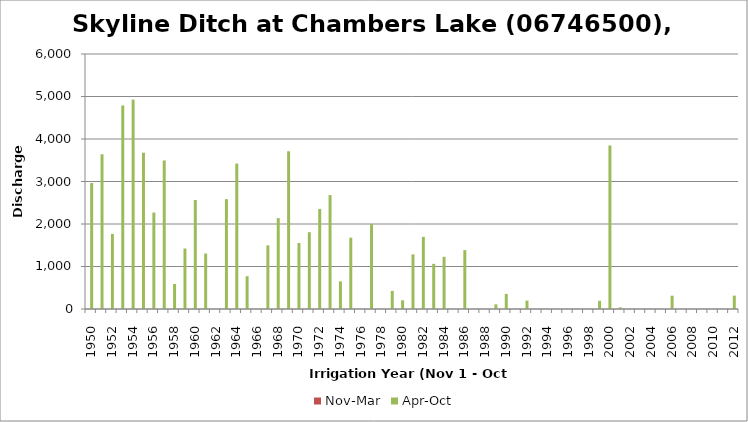
| Category | Nov-Mar | Apr-Oct |
|---|---|---|
| 1950.0 | 0 | 2964.74 |
| 1951.0 | 0 | 3639.72 |
| 1952.0 | 0 | 1767.3 |
| 1953.0 | 0 | 4788.77 |
| 1954.0 | 0 | 4927.02 |
| 1955.0 | 0 | 3677.41 |
| 1956.0 | 0 | 2269.12 |
| 1957.0 | 0 | 3494.93 |
| 1958.0 | 0 | 587.12 |
| 1959.0 | 0 | 1423.16 |
| 1960.0 | 0 | 2564.66 |
| 1961.0 | 0 | 1305.14 |
| 1962.0 | 0 | 0 |
| 1963.0 | 0 | 2585.3 |
| 1964.0 | 0 | 3421.54 |
| 1965.0 | 0 | 771.58 |
| 1966.0 | 0 | 0 |
| 1967.0 | 0 | 1497.54 |
| 1968.0 | 0 | 2138.21 |
| 1969.0 | 0 | 3711.13 |
| 1970.0 | 0 | 1553.08 |
| 1971.0 | 0 | 1806.97 |
| 1972.0 | 0 | 2354.41 |
| 1973.0 | 0 | 2679.71 |
| 1974.0 | 0 | 650.59 |
| 1975.0 | 0 | 1678.04 |
| 1976.0 | 0 | 0 |
| 1977.0 | 0 | 1998.17 |
| 1978.0 | 0 | 0 |
| 1979.0 | 0 | 426.45 |
| 1980.0 | 0 | 205.29 |
| 1981.0 | 0 | 1285.3 |
| 1982.0 | 0 | 1697.28 |
| 1983.0 | 0 | 1063.15 |
| 1984.0 | 0 | 1227.99 |
| 1985.0 | 0 | 0 |
| 1986.0 | 0 | 1386.11 |
| 1987.0 | 0 | 0 |
| 1988.0 | 0 | 0 |
| 1989.0 | 0 | 109.49 |
| 1990.0 | 0 | 355.05 |
| 1991.0 | 0 | 0 |
| 1992.0 | 0 | 197.95 |
| 1993.0 | 0 | 0 |
| 1994.0 | 0 | 0 |
| 1995.0 | 0 | 0 |
| 1996.0 | 0 | 0 |
| 1997.0 | 0 | 0 |
| 1998.0 | 0 | 0 |
| 1999.0 | 0 | 190.81 |
| 2000.0 | 0 | 3847.79 |
| 2001.0 | 0 | 38.66 |
| 2002.0 | 0 | 0 |
| 2003.0 | 0 | 0 |
| 2004.0 | 0 | 0 |
| 2005.0 | 0 | 0 |
| 2006.0 | 0 | 313 |
| 2007.0 | 0 | 0 |
| 2008.0 | 0 | 0 |
| 2009.0 | 0 | 0 |
| 2010.0 | 0 | 0 |
| 2011.0 | 0 | 0 |
| 2012.0 | 0 | 314.29 |